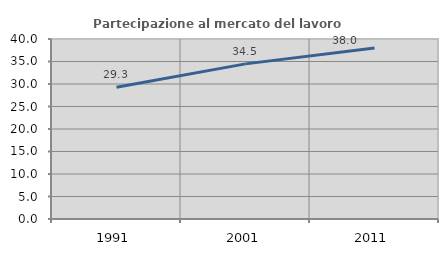
| Category | Partecipazione al mercato del lavoro  femminile |
|---|---|
| 1991.0 | 29.282 |
| 2001.0 | 34.475 |
| 2011.0 | 38.017 |